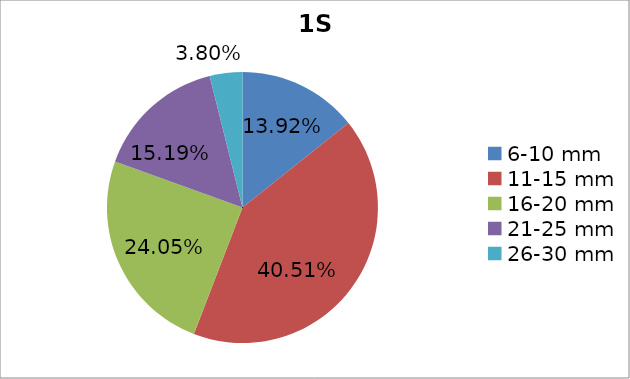
| Category | Series 0 |
|---|---|
| 6-10 mm | 0.139 |
| 11-15 mm | 0.405 |
| 16-20 mm | 0.24 |
| 21-25 mm | 0.152 |
| 26-30 mm | 0.038 |